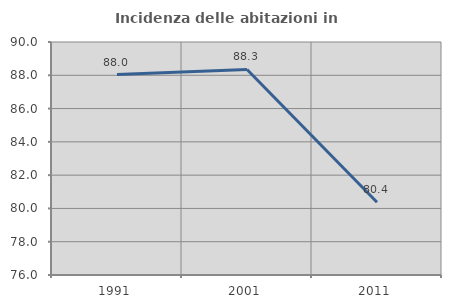
| Category | Incidenza delle abitazioni in proprietà  |
|---|---|
| 1991.0 | 88.043 |
| 2001.0 | 88.35 |
| 2011.0 | 80.374 |